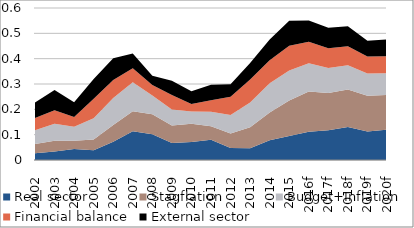
| Category | Real sector | Stagflation | Budget+Inflation | Financial balance | External sector |
|---|---|---|---|---|---|
| 2002 | 0.026 | 0.037 | 0.055 | 0.048 | 0.061 |
| 2003 | 0.034 | 0.042 | 0.067 | 0.053 | 0.08 |
| 2004 | 0.044 | 0.033 | 0.056 | 0.038 | 0.058 |
| 2005 | 0.039 | 0.042 | 0.084 | 0.077 | 0.078 |
| 2006 | 0.072 | 0.066 | 0.107 | 0.07 | 0.086 |
| 2007 | 0.114 | 0.079 | 0.114 | 0.055 | 0.059 |
| 2008 | 0.102 | 0.078 | 0.074 | 0.041 | 0.037 |
| 2009 | 0.067 | 0.069 | 0.063 | 0.057 | 0.056 |
| 2010 | 0.071 | 0.071 | 0.049 | 0.03 | 0.05 |
| 2011 | 0.08 | 0.053 | 0.057 | 0.046 | 0.061 |
| 2012 | 0.048 | 0.056 | 0.074 | 0.071 | 0.05 |
| 2013 | 0.047 | 0.083 | 0.097 | 0.091 | 0.065 |
| 2014 | 0.078 | 0.11 | 0.116 | 0.091 | 0.082 |
| 2015 | 0.095 | 0.14 | 0.118 | 0.098 | 0.098 |
| 2016f | 0.111 | 0.159 | 0.111 | 0.084 | 0.084 |
| 2017f | 0.117 | 0.148 | 0.099 | 0.078 | 0.08 |
| 2018f | 0.13 | 0.148 | 0.096 | 0.075 | 0.079 |
| 2019f | 0.113 | 0.141 | 0.087 | 0.068 | 0.062 |
| 2020f | 0.119 | 0.138 | 0.085 | 0.068 | 0.066 |